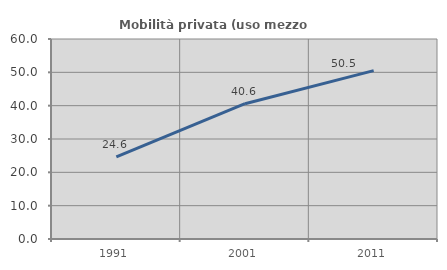
| Category | Mobilità privata (uso mezzo privato) |
|---|---|
| 1991.0 | 24.644 |
| 2001.0 | 40.593 |
| 2011.0 | 50.523 |